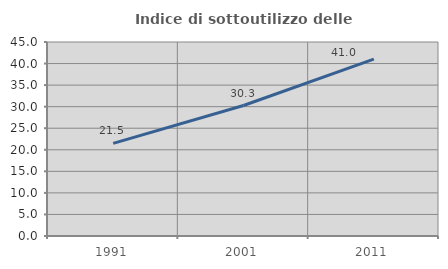
| Category | Indice di sottoutilizzo delle abitazioni  |
|---|---|
| 1991.0 | 21.481 |
| 2001.0 | 30.263 |
| 2011.0 | 41.026 |